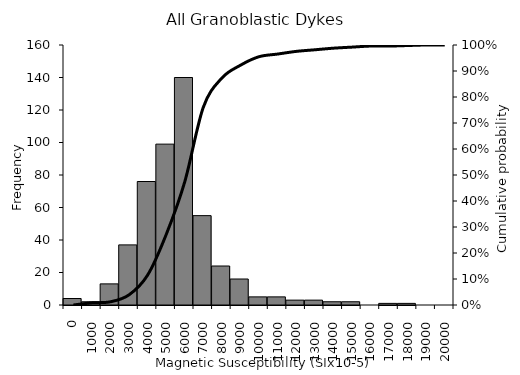
| Category | Series 1 |
|---|---|
| 0.0 | 4 |
| 1000.0 | 2 |
| 2000.0 | 13 |
| 3000.0 | 37 |
| 4000.0 | 76 |
| 5000.0 | 99 |
| 6000.0 | 140 |
| 7000.0 | 55 |
| 8000.0 | 24 |
| 9000.0 | 16 |
| 10000.0 | 5 |
| 11000.0 | 5 |
| 12000.0 | 3 |
| 13000.0 | 3 |
| 14000.0 | 2 |
| 15000.0 | 2 |
| 16000.0 | 0 |
| 17000.0 | 1 |
| 18000.0 | 1 |
| 19000.0 | 0 |
| 20000.0 | 0 |